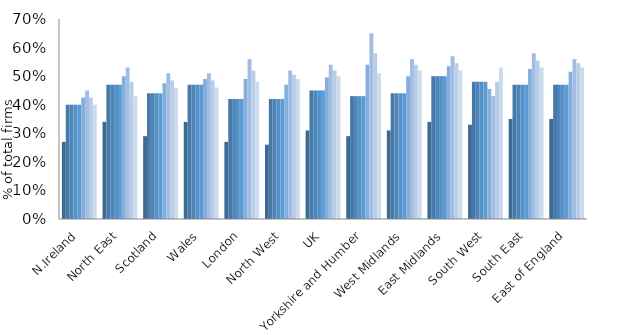
| Category | 2009 | 2010 | 2011 | 2012 | 2013 | 2014 | 2015 | 2016 | 2017 |
|---|---|---|---|---|---|---|---|---|---|
| N.Ireland | 0.27 | 0.4 | 0.4 | 0.4 | 0.4 | 0.425 | 0.45 | 0.425 | 0.4 |
| North East | 0.34 | 0.47 | 0.47 | 0.47 | 0.47 | 0.5 | 0.53 | 0.48 | 0.43 |
| Scotland | 0.29 | 0.44 | 0.44 | 0.44 | 0.44 | 0.475 | 0.51 | 0.485 | 0.46 |
| Wales | 0.34 | 0.47 | 0.47 | 0.47 | 0.47 | 0.49 | 0.51 | 0.485 | 0.46 |
| London | 0.27 | 0.42 | 0.42 | 0.42 | 0.42 | 0.49 | 0.56 | 0.52 | 0.48 |
| North West | 0.26 | 0.42 | 0.42 | 0.42 | 0.42 | 0.47 | 0.52 | 0.505 | 0.49 |
| UK | 0.31 | 0.45 | 0.45 | 0.45 | 0.45 | 0.495 | 0.54 | 0.52 | 0.5 |
| Yorkshire and Humber | 0.29 | 0.43 | 0.43 | 0.43 | 0.43 | 0.54 | 0.65 | 0.58 | 0.51 |
| West Midlands | 0.31 | 0.44 | 0.44 | 0.44 | 0.44 | 0.5 | 0.56 | 0.54 | 0.52 |
| East Midlands | 0.34 | 0.5 | 0.5 | 0.5 | 0.5 | 0.535 | 0.57 | 0.545 | 0.52 |
| South West | 0.33 | 0.48 | 0.48 | 0.48 | 0.48 | 0.455 | 0.43 | 0.48 | 0.53 |
| South East | 0.35 | 0.47 | 0.47 | 0.47 | 0.47 | 0.525 | 0.58 | 0.555 | 0.53 |
| East of England | 0.35 | 0.47 | 0.47 | 0.47 | 0.47 | 0.515 | 0.56 | 0.545 | 0.53 |